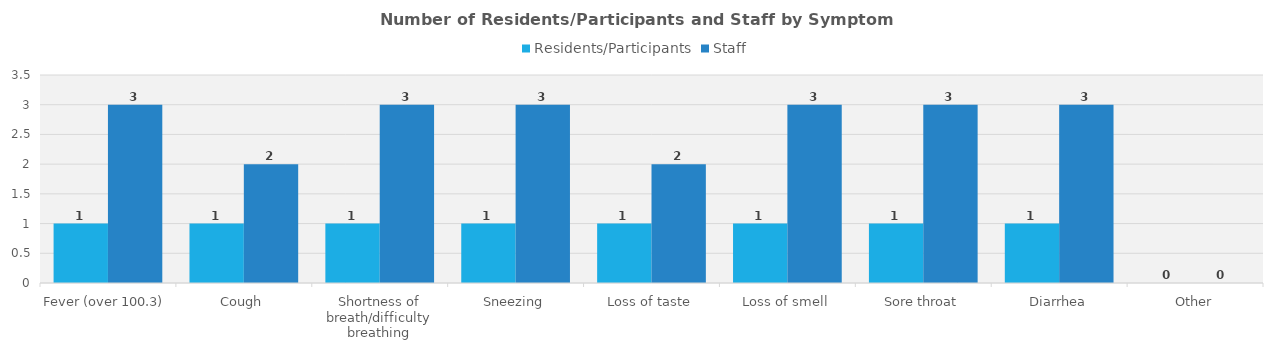
| Category | Residents/Participants | Staff |
|---|---|---|
| Fever (over 100.3) | 1 | 3 |
| Cough | 1 | 2 |
| Shortness of breath/difficulty breathing | 1 | 3 |
| Sneezing | 1 | 3 |
| Loss of taste | 1 | 2 |
| Loss of smell | 1 | 3 |
| Sore throat | 1 | 3 |
| Diarrhea | 1 | 3 |
| Other | 0 | 0 |